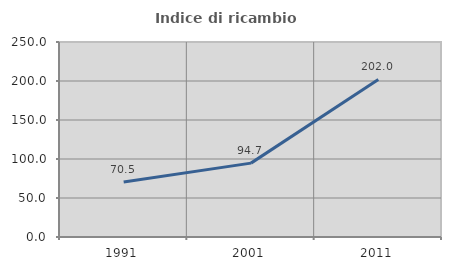
| Category | Indice di ricambio occupazionale  |
|---|---|
| 1991.0 | 70.473 |
| 2001.0 | 94.712 |
| 2011.0 | 202.019 |